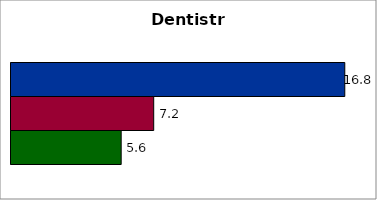
| Category | 50 states and D.C. | SREB states | State |
|---|---|---|---|
| 0 | 16.83 | 7.195 | 5.556 |